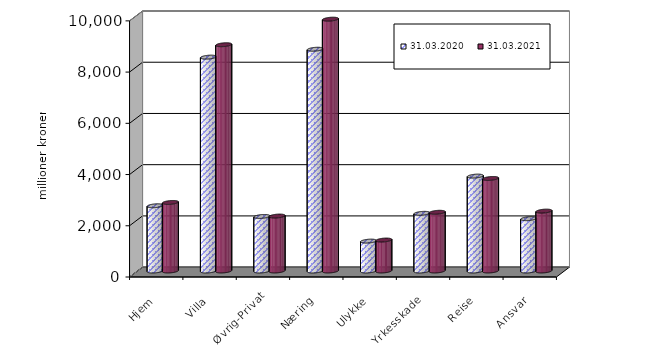
| Category | 31.03.2020 | 31.03.2021 |
|---|---|---|
| Hjem | 2546.317 | 2675.988 |
| Villa | 8349.885 | 8834.491 |
| Øvrig-Privat | 2129.668 | 2144.87 |
| Næring | 8657.609 | 9831.62 |
| Ulykke | 1166.647 | 1208.418 |
| Yrkesskade | 2251.755 | 2292.455 |
| Reise | 3704.966 | 3613.569 |
| Ansvar | 2044.178 | 2338.099 |